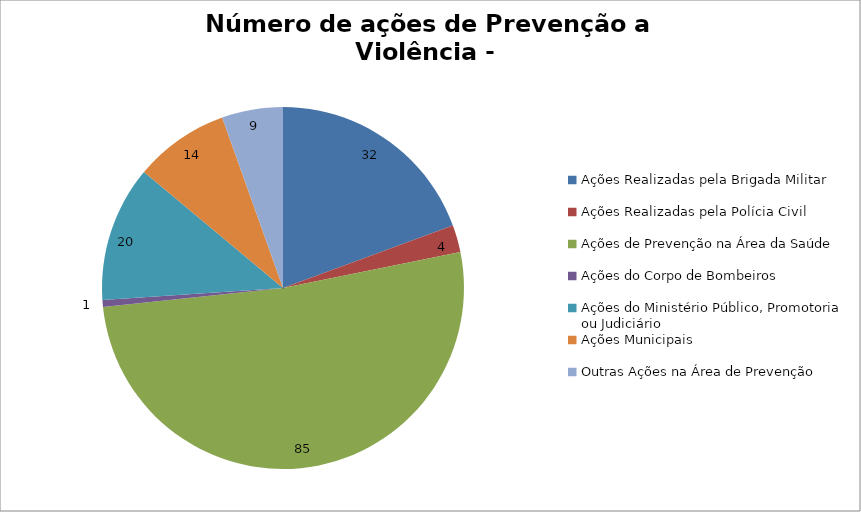
| Category | Número de Ações |
|---|---|
| Ações Realizadas pela Brigada Militar | 32 |
| Ações Realizadas pela Polícia Civil | 4 |
| Ações de Prevenção na Área da Saúde | 85 |
| Ações do Corpo de Bombeiros | 1 |
| Ações do Ministério Público, Promotoria ou Judiciário | 20 |
| Ações Municipais | 14 |
| Outras Ações na Área de Prevenção | 9 |